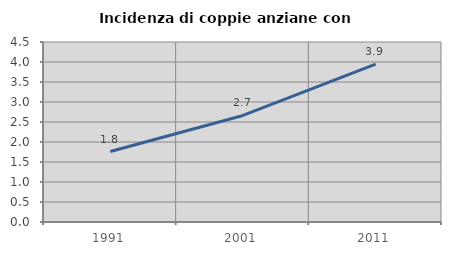
| Category | Incidenza di coppie anziane con figli |
|---|---|
| 1991.0 | 1.761 |
| 2001.0 | 2.664 |
| 2011.0 | 3.946 |